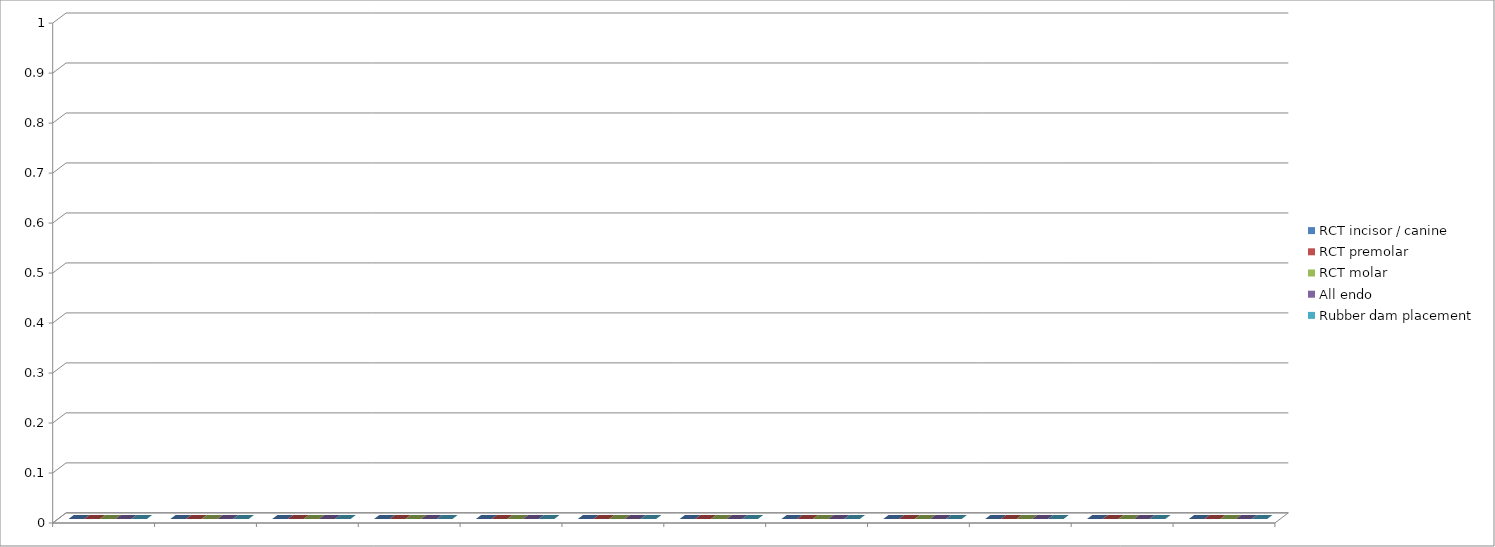
| Category | RCT incisor / canine | RCT premolar | RCT molar | All endo | Rubber dam placement |
|---|---|---|---|---|---|
| 0 | 0 | 0 | 0 | 0 | 0 |
| 1 | 0 | 0 | 0 | 0 | 0 |
| 2 | 0 | 0 | 0 | 0 | 0 |
| 3 | 0 | 0 | 0 | 0 | 0 |
| 4 | 0 | 0 | 0 | 0 | 0 |
| 5 | 0 | 0 | 0 | 0 | 0 |
| 6 | 0 | 0 | 0 | 0 | 0 |
| 7 | 0 | 0 | 0 | 0 | 0 |
| 8 | 0 | 0 | 0 | 0 | 0 |
| 9 | 0 | 0 | 0 | 0 | 0 |
| 10 | 0 | 0 | 0 | 0 | 0 |
| 11 | 0 | 0 | 0 | 0 | 0 |